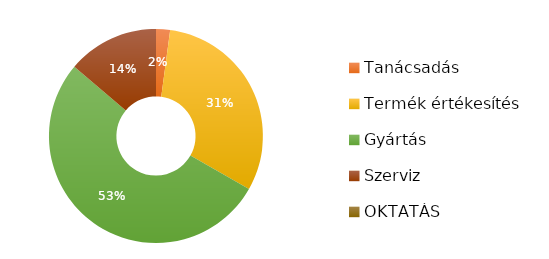
| Category | Összesen |
|---|---|
| Tanácsadás | 10000 |
| Termék értékesítés | 147000 |
| Gyártás | 250000 |
| Szerviz | 65231 |
| OKTATÁS | 0 |